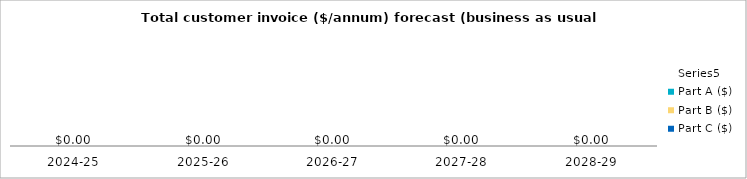
| Category | Part D ($) | Part C ($) | Part B ($) | Part A ($) | Label (annuity) | Series 5 |
|---|---|---|---|---|---|---|
| 2024-25 | 0 | 0 | 0 | 0 |  | 0 |
| 2025-26 | 0 | 0 | 0 | 0 |  | 0 |
| 2026-27 | 0 | 0 | 0 | 0 |  | 0 |
| 2027-28 | 0 | 0 | 0 | 0 |  | 0 |
| 2028-29 | 0 | 0 | 0 | 0 |  | 0 |